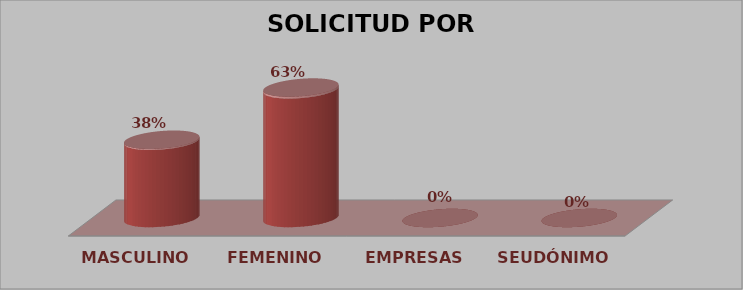
| Category | SOLICITUD POR GÉNERO | Series 1 |
|---|---|---|
| MASCULINO | 27 | 0.375 |
| FEMENINO | 45 | 0.625 |
| EMPRESAS | 0 | 0 |
| SEUDÓNIMO | 0 | 0 |